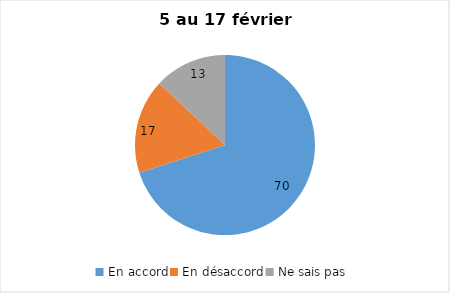
| Category | Series 0 |
|---|---|
| En accord | 70 |
| En désaccord | 17 |
| Ne sais pas | 13 |